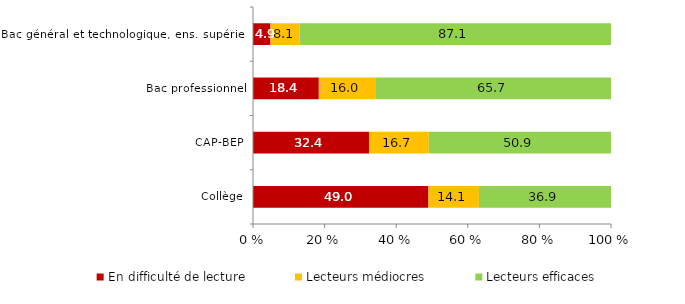
| Category | En difficulté de lecture | Lecteurs médiocres | Lecteurs efficaces |
|---|---|---|---|
| Collège | 49 | 14.1 | 36.9 |
| CAP-BEP | 32.4 | 16.7 | 50.907 |
| Bac professionnel | 18.4 | 16 | 65.7 |
| Bac général et technologique, ens. supérieur | 4.9 | 8.1 | 87.1 |